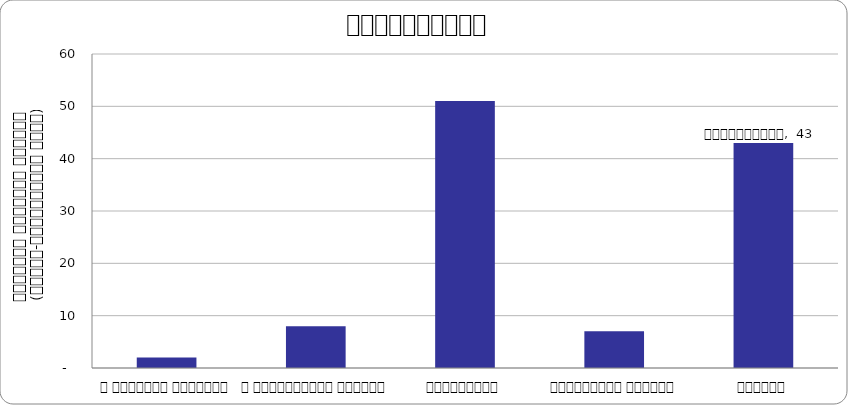
| Category | भ्रष्टाचार |
|---|---|
| द हिमालयन टाइम्स् | 2 |
| द काठमाण्डौं पोस्ट् | 8 |
| कान्तिपुर | 51 |
| अन्नपूर्ण पोस्ट् | 7 |
| नागरिक | 43 |